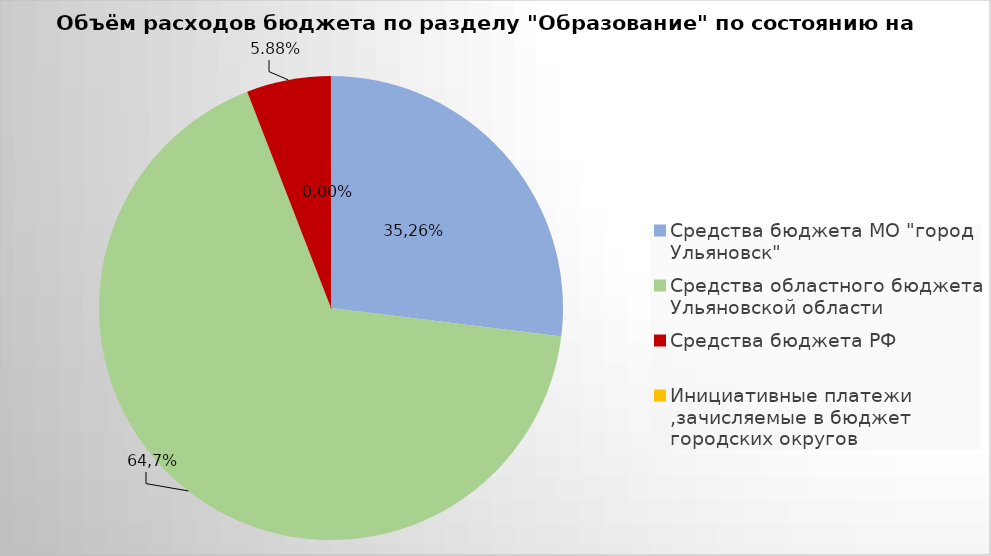
| Category | Series 0 |
|---|---|
| Средства бюджета МО "город Ульяновск" | 1843417.56 |
| Средства областного бюджета Ульяновской области | 4592243.24 |
| Средства бюджета РФ | 401928.3 |
| Инициативные платежи ,зачисляемые в бюджет городских округов | 200 |